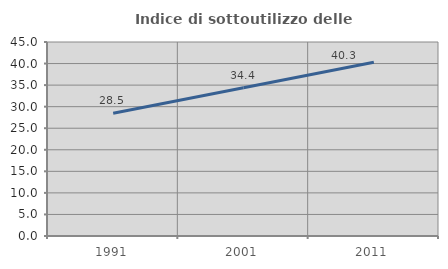
| Category | Indice di sottoutilizzo delle abitazioni  |
|---|---|
| 1991.0 | 28.481 |
| 2001.0 | 34.375 |
| 2011.0 | 40.314 |